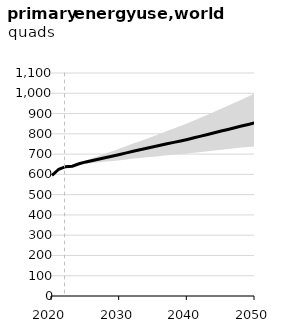
| Category | Series 1 |
|---|---|
| 2020.0 | 595.311 |
| 2021.0 | 625.235 |
| 2022.0 | 637.83 |
| 2023.0 | 640.121 |
| 2024.0 | 652.433 |
| 2025.0 | 661.369 |
| 2026.0 | 668.507 |
| 2027.0 | 675.968 |
| 2028.0 | 683.348 |
| 2029.0 | 690.755 |
| 2030.0 | 698.194 |
| 2031.0 | 705.986 |
| 2032.0 | 714.18 |
| 2033.0 | 721.465 |
| 2034.0 | 728.967 |
| 2035.0 | 736.36 |
| 2036.0 | 743.573 |
| 2037.0 | 750.676 |
| 2038.0 | 757.76 |
| 2039.0 | 764.843 |
| 2040.0 | 772.202 |
| 2041.0 | 780.232 |
| 2042.0 | 788.481 |
| 2043.0 | 796.707 |
| 2044.0 | 805.149 |
| 2045.0 | 813.551 |
| 2046.0 | 821.683 |
| 2047.0 | 829.98 |
| 2048.0 | 838.22 |
| 2049.0 | 846.337 |
| 2050.0 | 854.743 |